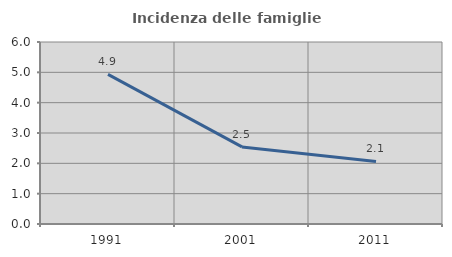
| Category | Incidenza delle famiglie numerose |
|---|---|
| 1991.0 | 4.932 |
| 2001.0 | 2.54 |
| 2011.0 | 2.062 |